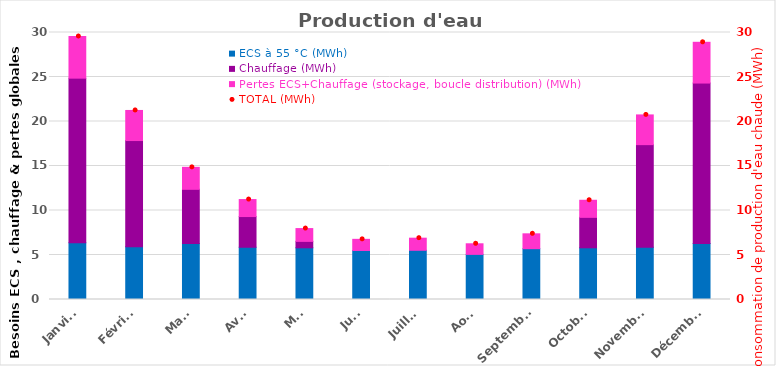
| Category | ECS à 55 °C (MWh) | Chauffage (MWh) | Pertes ECS+Chauffage (stockage, boucle distribution) (MWh) |
|---|---|---|---|
| Janvier | 6.37 | 18.5 | 4.68 |
| Février | 5.93 | 11.93 | 3.38 |
| Mars | 6.28 | 6.1 | 2.47 |
| Avril | 5.87 | 3.45 | 1.91 |
| Mai | 5.81 | 0.72 | 1.44 |
| Juin | 5.51 | 0 | 1.25 |
| Juillet | 5.53 | 0 | 1.36 |
| Août | 5.07 | 0 | 1.19 |
| Septembre | 5.71 | 0 | 1.67 |
| Octobre | 5.81 | 3.42 | 1.92 |
| Novembre | 5.87 | 11.53 | 3.34 |
| Décembre | 6.28 | 18.04 | 4.58 |